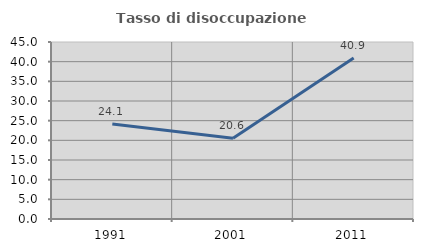
| Category | Tasso di disoccupazione giovanile  |
|---|---|
| 1991.0 | 24.129 |
| 2001.0 | 20.553 |
| 2011.0 | 40.933 |